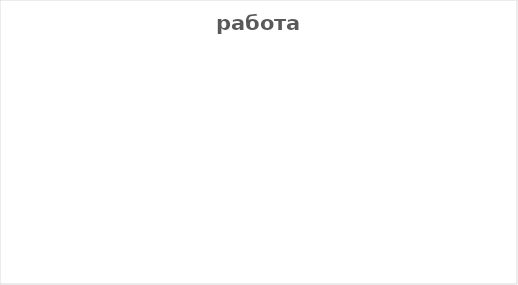
| Category | Series 0 |
|---|---|
| Нетерпеливость | 0 |
| Решительность | 0 |
| Виктимность | 0 |